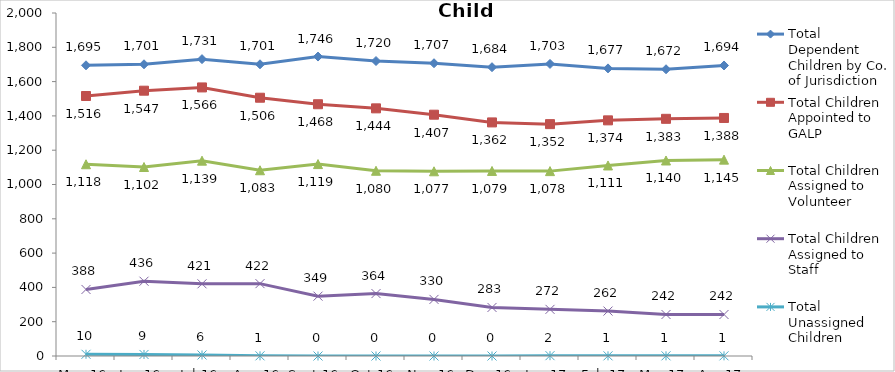
| Category | Total Dependent Children by Co. of Jurisdiction | Total Children Appointed to GALP | Total Children Assigned to Volunteer | Total Children Assigned to Staff | Total Unassigned Children |
|---|---|---|---|---|---|
| May-16 | 1695 | 1516 | 1118 | 388 | 10 |
| Jun-16 | 1701 | 1547 | 1102 | 436 | 9 |
| Jul-16 | 1731 | 1566 | 1139 | 421 | 6 |
| Aug-16 | 1701 | 1506 | 1083 | 422 | 1 |
| Sep-16 | 1746 | 1468 | 1119 | 349 | 0 |
| Oct-16 | 1720 | 1444 | 1080 | 364 | 0 |
| Nov-16 | 1707 | 1407 | 1077 | 330 | 0 |
| Dec-16 | 1684 | 1362 | 1079 | 283 | 0 |
| Jan-17 | 1703 | 1352 | 1078 | 272 | 2 |
| Feb-17 | 1677 | 1374 | 1111 | 262 | 1 |
| Mar-17 | 1672 | 1383 | 1140 | 242 | 1 |
| Apr-17 | 1694 | 1388 | 1145 | 242 | 1 |